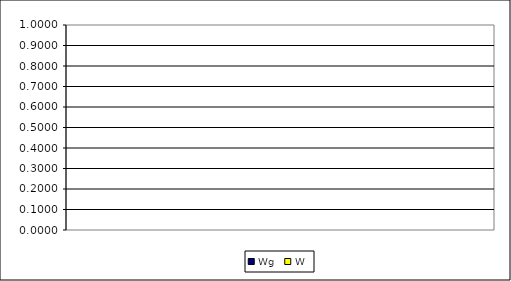
| Category | Wg | W |
|---|---|---|
| 0 | 0 | 0 |